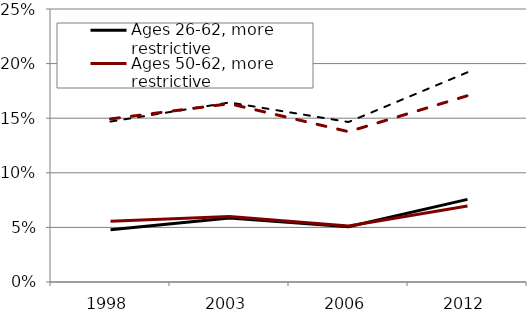
| Category | Ages 26-62, more restrictive | Ages 50-62, more restrictive | Ages 26-62, less restrictive | Ages 50-62, less restrictive |
|---|---|---|---|---|
| 1998.0 | 0.048 | 0.056 | 0.147 | 0.149 |
| 2003.0 | 0.059 | 0.06 | 0.164 | 0.163 |
| 2006.0 | 0.051 | 0.051 | 0.146 | 0.138 |
| 2012.0 | 0.076 | 0.07 | 0.192 | 0.171 |